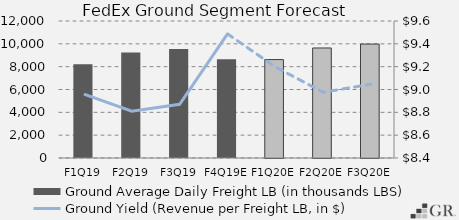
| Category | Ground Average Daily Freight LB (in thousands LBS) |
|---|---|
|  F1Q19  | 8221 |
|  F2Q19  | 9237 |
|  F3Q19  | 9550 |
|  F4Q19E  | 8660.418 |
|  F1Q20E  | 8619.787 |
|  F2Q20E  | 9637.12 |
|  F3Q20E  | 9978.7 |